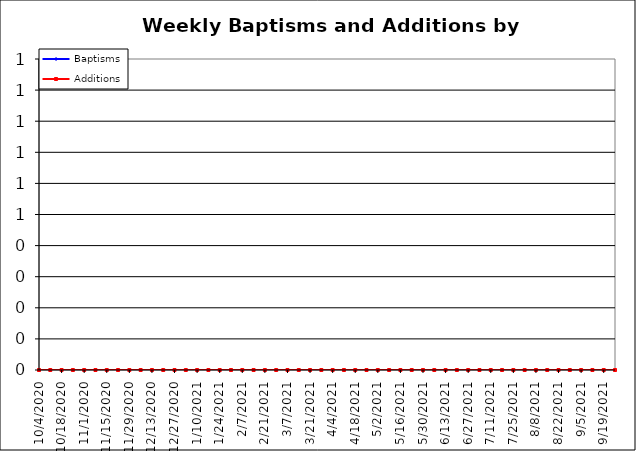
| Category | Baptisms | Additions |
|---|---|---|
| 10/4/20 | 0 | 0 |
| 10/11/20 | 0 | 0 |
| 10/18/20 | 0 | 0 |
| 10/25/20 | 0 | 0 |
| 11/1/20 | 0 | 0 |
| 11/8/20 | 0 | 0 |
| 11/15/20 | 0 | 0 |
| 11/22/20 | 0 | 0 |
| 11/29/20 | 0 | 0 |
| 12/6/20 | 0 | 0 |
| 12/13/20 | 0 | 0 |
| 12/20/20 | 0 | 0 |
| 12/27/20 | 0 | 0 |
| 1/3/21 | 0 | 0 |
| 1/10/21 | 0 | 0 |
| 1/17/21 | 0 | 0 |
| 1/24/21 | 0 | 0 |
| 1/31/21 | 0 | 0 |
| 2/7/21 | 0 | 0 |
| 2/14/21 | 0 | 0 |
| 2/21/21 | 0 | 0 |
| 2/28/21 | 0 | 0 |
| 3/7/21 | 0 | 0 |
| 3/14/21 | 0 | 0 |
| 3/21/21 | 0 | 0 |
| 3/28/21 | 0 | 0 |
| 4/4/21 | 0 | 0 |
| 4/11/21 | 0 | 0 |
| 4/18/21 | 0 | 0 |
| 4/25/21 | 0 | 0 |
| 5/2/21 | 0 | 0 |
| 5/9/21 | 0 | 0 |
| 5/16/21 | 0 | 0 |
| 5/23/21 | 0 | 0 |
| 5/30/21 | 0 | 0 |
| 6/6/21 | 0 | 0 |
| 6/13/21 | 0 | 0 |
| 6/20/21 | 0 | 0 |
| 6/27/21 | 0 | 0 |
| 7/4/21 | 0 | 0 |
| 7/11/21 | 0 | 0 |
| 7/18/21 | 0 | 0 |
| 7/25/21 | 0 | 0 |
| 8/1/21 | 0 | 0 |
| 8/8/21 | 0 | 0 |
| 8/15/21 | 0 | 0 |
| 8/22/21 | 0 | 0 |
| 8/29/21 | 0 | 0 |
| 9/5/21 | 0 | 0 |
| 9/12/21 | 0 | 0 |
| 9/19/21 | 0 | 0 |
| 9/26/21 | 0 | 0 |